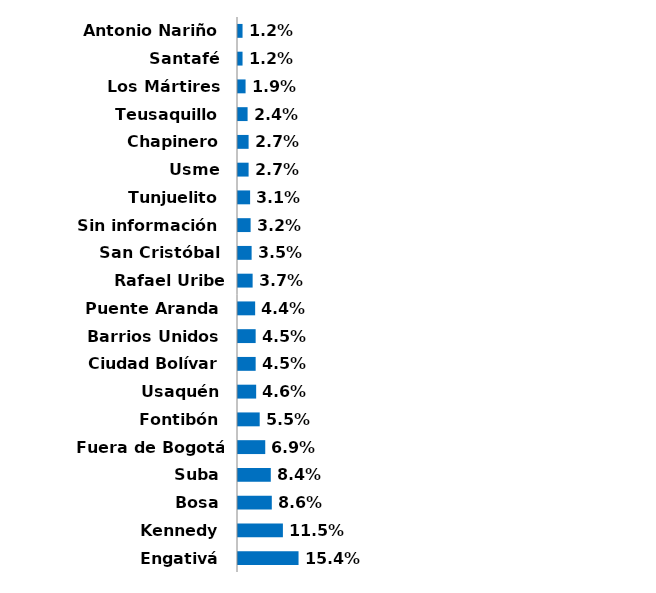
| Category | Series 0 |
|---|---|
| Antonio Nariño | 0.012 |
| Santafé | 0.012 |
| Los Mártires | 0.019 |
| Teusaquillo | 0.024 |
| Chapinero | 0.027 |
| Usme | 0.027 |
| Tunjuelito | 0.031 |
| Sin información | 0.032 |
| San Cristóbal | 0.035 |
| Rafael Uribe Uribe | 0.037 |
| Puente Aranda | 0.044 |
| Barrios Unidos | 0.045 |
| Ciudad Bolívar | 0.045 |
| Usaquén | 0.046 |
| Fontibón | 0.055 |
| Fuera de Bogotá | 0.069 |
| Suba | 0.084 |
| Bosa | 0.086 |
| Kennedy | 0.115 |
| Engativá | 0.154 |